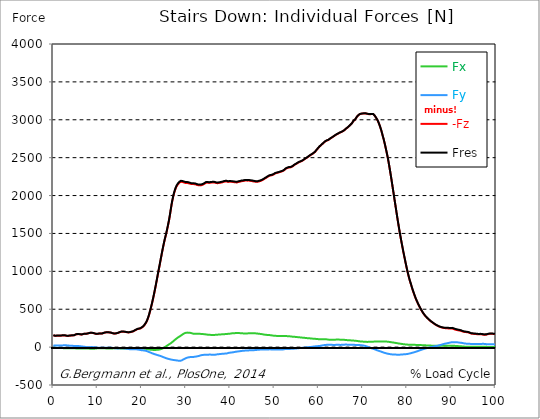
| Category |  Fx |  Fy |  -Fz |  Fres |
|---|---|---|---|---|
| 0.0 | -9.16 | 22.89 | 155.82 | 157.87 |
| 0.167348456675344 | -9.49 | 23.09 | 152.48 | 154.61 |
| 0.334696913350688 | -9.52 | 22.23 | 149.1 | 151.15 |
| 0.5020453700260321 | -9.45 | 20.8 | 147.47 | 149.35 |
| 0.669393826701376 | -9.99 | 20.54 | 149.6 | 151.47 |
| 0.83674228337672 | -10.46 | 20.52 | 150.97 | 152.86 |
| 1.0040907400520642 | -10.82 | 20.86 | 151.29 | 153.24 |
| 1.1621420602454444 | -11.21 | 21.27 | 151.46 | 153.48 |
| 1.3294905169207885 | -11.56 | 21.58 | 151.35 | 153.42 |
| 1.4968389735961325 | -11.87 | 21.76 | 151.11 | 153.22 |
| 1.6641874302714765 | -12.12 | 21.72 | 151.21 | 153.3 |
| 1.8315358869468206 | -12.44 | 21.9 | 151.99 | 154.1 |
| 1.9988843436221646 | -12.81 | 22.2 | 152.99 | 155.16 |
| 2.1662328002975086 | -13.33 | 22.83 | 153.65 | 155.95 |
| 2.333581256972853 | -13.98 | 23.44 | 153.94 | 156.39 |
| 2.5009297136481967 | -14.52 | 23.84 | 153.37 | 155.95 |
| 2.6682781703235405 | -14.69 | 23.63 | 152.65 | 155.23 |
| 2.8356266269988843 | -14.75 | 23.31 | 150.67 | 153.25 |
| 3.002975083674229 | -14.78 | 22.97 | 148.43 | 151.01 |
| 3.1703235403495724 | -14.68 | 21.73 | 147.75 | 150.15 |
| 3.337671997024917 | -14.65 | 20.61 | 147.42 | 149.69 |
| 3.4957233172182973 | -14.83 | 19.71 | 149.29 | 151.45 |
| 3.663071773893641 | -15.05 | 19.29 | 150.91 | 153.03 |
| 3.8304202305689854 | -15.22 | 18.86 | 151.89 | 153.96 |
| 3.997768687244329 | -15.37 | 18.33 | 152.61 | 154.6 |
| 4.165117143919673 | -15.52 | 17.8 | 153.38 | 155.29 |
| 4.332465600595017 | -15.64 | 17.13 | 154.09 | 155.9 |
| 4.499814057270361 | -15.7 | 16.07 | 154.5 | 156.17 |
| 4.667162513945706 | -15.73 | 14.96 | 155.56 | 157.1 |
| 4.834510970621049 | -15.98 | 14.21 | 160.69 | 162.16 |
| 5.001859427296393 | -16.6 | 14.27 | 165.57 | 167.05 |
| 5.169207883971737 | -17.25 | 14.56 | 168.1 | 169.66 |
| 5.336556340647081 | -17.75 | 14.38 | 170.51 | 172.08 |
| 5.503904797322425 | -18.27 | 14.1 | 171.8 | 173.39 |
| 5.671253253997769 | -18.68 | 13.67 | 171.82 | 173.42 |
| 5.82930457419115 | -18.97 | 13.1 | 170.63 | 172.23 |
| 5.996653030866494 | -19.15 | 12.35 | 169.05 | 170.62 |
| 6.164001487541838 | -19.1 | 11.01 | 167.71 | 169.21 |
| 6.331349944217181 | -18.91 | 9.41 | 166.06 | 167.45 |
| 6.498698400892526 | -18.86 | 8.03 | 167.76 | 169.07 |
| 6.66604685756787 | -18.85 | 6.7 | 170.18 | 171.43 |
| 6.833395314243213 | -19.04 | 5.73 | 173.11 | 174.32 |
| 7.000743770918558 | -19.59 | 5.39 | 176.33 | 177.56 |
| 7.168092227593902 | -19.43 | 3.8 | 175.71 | 176.88 |
| 7.335440684269246 | -18.95 | 1.55 | 175.1 | 176.18 |
| 7.50278914094459 | -18.54 | -0.43 | 175.36 | 176.37 |
| 7.6701375976199335 | -18.47 | -1.38 | 178.2 | 179.19 |
| 7.837486054295278 | -18.98 | -1.07 | 181.59 | 182.62 |
| 7.995537374488658 | -19.49 | -0.81 | 183.07 | 184.14 |
| 8.162885831164003 | -20.09 | -0.51 | 185.28 | 186.4 |
| 8.330234287839346 | -20.71 | -0.25 | 188.39 | 189.56 |
| 8.49758274451469 | -21.21 | -0.15 | 188.85 | 190.06 |
| 8.664931201190035 | -21.69 | 0.11 | 188.81 | 190.07 |
| 8.832279657865378 | -21.8 | -0.03 | 187.63 | 188.92 |
| 8.999628114540721 | -21.65 | -0.34 | 185.71 | 187 |
| 9.166976571216066 | -21.29 | -0.78 | 183.13 | 184.4 |
| 9.334325027891412 | -20.39 | -1.76 | 179.9 | 181.11 |
| 9.501673484566755 | -19.14 | -3.19 | 176.65 | 177.77 |
| 9.669021941242098 | -17.88 | -4.83 | 174.48 | 175.54 |
| 9.836370397917442 | -16.6 | -6.27 | 173.79 | 174.78 |
| 10.003718854592787 | -15.54 | -7.38 | 174.67 | 175.6 |
| 10.17106731126813 | -14.78 | -8.24 | 175.96 | 176.85 |
| 10.329118631461512 | -14.58 | -8.43 | 178.68 | 179.54 |
| 10.496467088136853 | -15.08 | -7.61 | 179.69 | 180.56 |
| 10.663815544812199 | -15.01 | -7.97 | 178.7 | 179.59 |
| 10.831164001487544 | -14.57 | -9.21 | 177.78 | 178.7 |
| 10.998512458162887 | -14.37 | -9.94 | 179.1 | 180.05 |
| 11.16586091483823 | -14.45 | -10.17 | 182.15 | 183.1 |
| 11.333209371513574 | -14.9 | -9.86 | 185.92 | 186.86 |
| 11.50055782818892 | -15.4 | -9.53 | 189.41 | 190.35 |
| 11.667906284864264 | -16.22 | -8.82 | 192.56 | 193.52 |
| 11.835254741539607 | -17.03 | -8.16 | 194.57 | 195.55 |
| 12.00260319821495 | -17.73 | -7.68 | 195.25 | 196.27 |
| 12.169951654890292 | -18.38 | -7.29 | 195.77 | 196.83 |
| 12.337300111565641 | -18.79 | -7.17 | 195.31 | 196.4 |
| 12.504648568240984 | -19.02 | -7.23 | 194.37 | 195.5 |
| 12.662699888434362 | -19.22 | -7.24 | 193.53 | 194.68 |
| 12.830048345109708 | -19.39 | -7.26 | 192.66 | 193.82 |
| 12.997396801785053 | -19.04 | -7.84 | 190.66 | 191.82 |
| 13.164745258460396 | -18.52 | -8.72 | 187.47 | 188.65 |
| 13.33209371513574 | -17.8 | -10.02 | 183.85 | 185.06 |
| 13.499442171811083 | -16.85 | -11.58 | 181.25 | 182.5 |
| 13.666790628486426 | -15.84 | -12.95 | 179.54 | 180.82 |
| 13.834139085161771 | -15.03 | -14.16 | 178.75 | 180.06 |
| 14.001487541837117 | -14.6 | -15.21 | 179.49 | 180.83 |
| 14.16883599851246 | -14.34 | -16.13 | 180.72 | 182.1 |
| 14.336184455187803 | -14.41 | -16.69 | 182.67 | 184.08 |
| 14.503532911863147 | -14.73 | -17.03 | 185.28 | 186.72 |
| 14.670881368538492 | -15.28 | -17.06 | 188.56 | 190.01 |
| 14.828932688731873 | -15.98 | -16.81 | 192.54 | 193.99 |
| 14.996281145407215 | -16.99 | -16.45 | 196.43 | 197.9 |
| 15.163629602082558 | -18.12 | -16.14 | 200.28 | 201.78 |
| 15.330978058757903 | -18.94 | -15.98 | 202.92 | 204.46 |
| 15.498326515433247 | -19.64 | -16.03 | 203.81 | 205.41 |
| 15.665674972108594 | -19.85 | -16.21 | 203.57 | 205.22 |
| 15.833023428783937 | -19.84 | -16.56 | 203.56 | 205.23 |
| 16.00037188545928 | -19.73 | -17.07 | 202.83 | 204.53 |
| 16.167720342134626 | -19.31 | -17.97 | 201.37 | 203.13 |
| 16.335068798809967 | -18.68 | -19.11 | 199.68 | 201.52 |
| 16.502417255485312 | -17.76 | -20.55 | 197.77 | 199.69 |
| 16.669765712160658 | -16.66 | -22.15 | 195.93 | 197.96 |
| 16.837114168836 | -15.44 | -23.75 | 194.41 | 196.56 |
| 17.004462625511344 | -14.16 | -25.31 | 193.71 | 195.99 |
| 17.16251394570472 | -13.1 | -26.7 | 194.54 | 196.92 |
| 17.32986240238007 | -12.29 | -27.82 | 196.38 | 198.84 |
| 17.497210859055414 | -11.89 | -28.48 | 198.99 | 201.5 |
| 17.664559315730756 | -11.54 | -29.09 | 201.31 | 203.84 |
| 17.8319077724061 | -12.12 | -28.77 | 203.42 | 205.94 |
| 17.999256229081443 | -12.63 | -28.57 | 206.62 | 209.1 |
| 18.166604685756788 | -13.29 | -28.3 | 211.44 | 213.88 |
| 18.333953142432133 | -14.27 | -28.11 | 217.42 | 219.82 |
| 18.501301599107478 | -15.4 | -28.16 | 222.91 | 225.33 |
| 18.668650055782823 | -16.52 | -28.58 | 227.45 | 229.95 |
| 18.835998512458165 | -17.5 | -29.37 | 232.34 | 234.95 |
| 19.00334696913351 | -18.41 | -30.59 | 237.66 | 240.42 |
| 19.170695425808855 | -18.69 | -31.83 | 240.12 | 243.02 |
| 19.338043882484197 | -18.34 | -33.73 | 241.93 | 245.02 |
| 19.496095202677576 | -17.73 | -35.94 | 244.01 | 247.34 |
| 19.66344365935292 | -16.97 | -38.07 | 246.4 | 249.97 |
| 19.830792116028263 | -16.53 | -39.95 | 250.06 | 253.86 |
| 19.998140572703612 | -17.3 | -41.3 | 257.66 | 261.6 |
| 20.165489029378953 | -17.8 | -42.34 | 264.84 | 268.87 |
| 20.3328374860543 | -18.72 | -42.86 | 272.29 | 276.35 |
| 20.500185942729644 | -19.86 | -44.02 | 282.55 | 286.72 |
| 20.667534399404985 | -21.26 | -45.98 | 296.39 | 300.75 |
| 20.83488285608033 | -22.73 | -47.48 | 308.97 | 313.48 |
| 21.002231312755672 | -24.32 | -50.17 | 326.22 | 331.01 |
| 21.16957976943102 | -25.97 | -53.54 | 346.76 | 351.9 |
| 21.336928226106362 | -27.73 | -57.22 | 370.89 | 376.37 |
| 21.504276682781704 | -29.51 | -61.04 | 397.71 | 403.51 |
| 21.67162513945705 | -31.08 | -65.09 | 430.25 | 436.32 |
| 21.82967645965043 | -32.6 | -69.21 | 466.25 | 472.55 |
| 21.997024916325774 | -33.96 | -73.28 | 503.44 | 509.94 |
| 22.16437337300112 | -35.09 | -77.51 | 542.06 | 548.76 |
| 22.33172182967646 | -35.96 | -81.75 | 582.2 | 589.09 |
| 22.499070286351806 | -36.68 | -85.5 | 625.29 | 632.26 |
| 22.666418743027148 | -37.28 | -88.86 | 670.4 | 677.38 |
| 22.833767199702496 | -37.69 | -92.04 | 717.51 | 724.46 |
| 23.00111565637784 | -37.5 | -95.14 | 765.56 | 772.45 |
| 23.168464113053183 | -36.64 | -98.15 | 815.32 | 822.13 |
| 23.335812569728528 | -36.15 | -101.13 | 865.42 | 872.16 |
| 23.50316102640387 | -35.46 | -104.37 | 918.98 | 925.68 |
| 23.670509483079215 | -34.35 | -107.33 | 970.09 | 976.72 |
| 23.83785793975456 | -32.92 | -110.11 | 1020.82 | 1027.38 |
| 23.995909259947936 | -31.12 | -112.9 | 1071.5 | 1077.96 |
| 24.163257716623285 | -28.6 | -116.14 | 1122.92 | 1129.37 |
| 24.330606173298627 | -25.85 | -119.58 | 1174.81 | 1181.26 |
| 24.49795462997397 | -22.29 | -123.34 | 1225.18 | 1231.67 |
| 24.665303086649313 | -17.99 | -127.37 | 1275.25 | 1281.82 |
| 24.83265154332466 | -13.43 | -131.45 | 1324.68 | 1331.34 |
| 25.0 | -8.04 | -135.09 | 1369.23 | 1376 |
| 25.167348456675345 | -2.21 | -138.92 | 1413.29 | 1420.22 |
| 25.334696913350694 | 4.08 | -142.64 | 1451.63 | 1458.73 |
| 25.502045370026035 | 10.59 | -146.27 | 1491.35 | 1498.62 |
| 25.669393826701377 | 17.35 | -149.62 | 1534.36 | 1541.8 |
| 25.836742283376722 | 24.07 | -152.76 | 1580.52 | 1588.14 |
| 26.004090740052067 | 30.53 | -155.41 | 1627.95 | 1635.71 |
| 26.17143919672741 | 36.85 | -157.76 | 1675.42 | 1683.3 |
| 26.329490516920792 | 42.66 | -160.51 | 1733.06 | 1741.08 |
| 26.49683897359613 | 48.99 | -163.1 | 1794.27 | 1802.39 |
| 26.66418743027148 | 55.86 | -164.6 | 1855.33 | 1863.53 |
| 26.831535886946828 | 63.55 | -166.26 | 1911.75 | 1920.11 |
| 26.998884343622166 | 72.15 | -168.48 | 1958 | 1966.64 |
| 27.166232800297514 | 80.38 | -170.04 | 2003.2 | 2012.1 |
| 27.333581256972852 | 88.71 | -171.26 | 2037.13 | 2046.34 |
| 27.5009297136482 | 96.88 | -172.46 | 2069.04 | 2078.57 |
| 27.668278170323543 | 104.81 | -173.74 | 2096.3 | 2106.18 |
| 27.835626626998888 | 112.41 | -175.24 | 2117.28 | 2127.59 |
| 28.002975083674233 | 120.04 | -176.6 | 2135 | 2145.75 |
| 28.170323540349575 | 127.57 | -178.09 | 2148.45 | 2159.68 |
| 28.33767199702492 | 133.62 | -179.65 | 2159.14 | 2170.81 |
| 28.50502045370026 | 139.14 | -180.92 | 2170.66 | 2182.7 |
| 28.663071773893645 | 145.27 | -181.13 | 2178.99 | 2191.4 |
| 28.830420230568986 | 152.11 | -179.22 | 2181.98 | 2194.68 |
| 28.99776868724433 | 158.87 | -175.4 | 2182.6 | 2195.49 |
| 29.165117143919673 | 166.14 | -170.24 | 2179.12 | 2192.16 |
| 29.33246560059502 | 172.55 | -165.09 | 2176.04 | 2189.21 |
| 29.499814057270367 | 178.44 | -159.57 | 2173.25 | 2186.5 |
| 29.66716251394571 | 183.14 | -154.16 | 2170.6 | 2183.87 |
| 29.834510970621054 | 186.97 | -149.42 | 2166.68 | 2179.98 |
| 30.00185942729639 | 189.24 | -145.08 | 2166.55 | 2179.76 |
| 30.169207883971744 | 190.72 | -140.87 | 2166.32 | 2179.4 |
| 30.33655634064708 | 191.3 | -137.96 | 2166.18 | 2179.12 |
| 30.50390479732243 | 191.19 | -135.67 | 2162.99 | 2175.8 |
| 30.671253253997772 | 190.31 | -133.55 | 2161.47 | 2174.08 |
| 30.829304574191156 | 189.24 | -131.77 | 2157.81 | 2170.24 |
| 30.996653030866494 | 187.57 | -131.2 | 2153.82 | 2166.08 |
| 31.164001487541842 | 185.19 | -131.2 | 2151.67 | 2163.73 |
| 31.331349944217187 | 182.09 | -130.82 | 2151.24 | 2163.01 |
| 31.498698400892525 | 178.82 | -130.7 | 2151.9 | 2163.39 |
| 31.666046857567874 | 176.58 | -129.97 | 2152.21 | 2163.47 |
| 31.833395314243212 | 175.59 | -128.63 | 2150.4 | 2161.52 |
| 32.00074377091856 | 175.09 | -126.92 | 2150.48 | 2161.47 |
| 32.1680922275939 | 174.77 | -125.3 | 2147.36 | 2158.26 |
| 32.33544068426925 | 175.67 | -123.61 | 2143.1 | 2153.98 |
| 32.50278914094459 | 176.1 | -121.72 | 2139.32 | 2150.15 |
| 32.670137597619934 | 176.18 | -119.6 | 2136.43 | 2147.17 |
| 32.83748605429528 | 175.86 | -117.11 | 2135.32 | 2145.92 |
| 33.004834510970625 | 175.54 | -114.63 | 2134.21 | 2144.67 |
| 33.162885831164004 | 174.97 | -111.75 | 2134.27 | 2144.57 |
| 33.33023428783935 | 174.38 | -108.75 | 2135.62 | 2145.73 |
| 33.497582744514695 | 173.75 | -106.04 | 2137.51 | 2147.48 |
| 33.664931201190036 | 173.1 | -103.58 | 2139.86 | 2149.69 |
| 33.83227965786538 | 172.23 | -102.62 | 2144.46 | 2154.18 |
| 33.99962811454073 | 170.93 | -102.32 | 2149.24 | 2158.84 |
| 34.16697657121607 | 169.84 | -102.01 | 2155.83 | 2165.31 |
| 34.33432502789141 | 168.76 | -101.7 | 2162.43 | 2171.79 |
| 34.50167348456676 | 167.59 | -101.59 | 2168.62 | 2177.86 |
| 34.6690219412421 | 165.82 | -101.05 | 2171.95 | 2181.02 |
| 34.83637039791744 | 164.29 | -100.84 | 2170.78 | 2179.73 |
| 35.00371885459279 | 163.63 | -99.72 | 2167.65 | 2176.52 |
| 35.17106731126814 | 162.97 | -99.04 | 2166.9 | 2175.68 |
| 35.338415767943474 | 162.37 | -98.65 | 2167.18 | 2175.9 |
| 35.49646708813686 | 161.64 | -98.9 | 2169.43 | 2178.09 |
| 35.6638155448122 | 160.93 | -99.33 | 2170.85 | 2179.47 |
| 35.831164001487544 | 160.29 | -99.7 | 2171.71 | 2180.3 |
| 35.998512458162885 | 159.97 | -99.91 | 2173.09 | 2181.66 |
| 36.165860914838234 | 160.25 | -100.1 | 2174 | 2182.59 |
| 36.333209371513576 | 160.64 | -100.15 | 2173.64 | 2182.26 |
| 36.50055782818892 | 161.27 | -100 | 2170.99 | 2179.66 |
| 36.667906284864266 | 161.98 | -99.4 | 2167.13 | 2175.84 |
| 36.83525474153961 | 162.68 | -97.59 | 2164.42 | 2173.09 |
| 37.002603198214956 | 163.49 | -95.88 | 2163.24 | 2171.86 |
| 37.1699516548903 | 164.48 | -94.83 | 2163.51 | 2172.13 |
| 37.337300111565646 | 165.34 | -93.52 | 2165.71 | 2174.3 |
| 37.50464856824098 | 166.07 | -92.6 | 2166.7 | 2175.28 |
| 37.66269988843437 | 166.77 | -91.58 | 2168.27 | 2176.83 |
| 37.83004834510971 | 167.47 | -90.51 | 2170.09 | 2178.63 |
| 37.99739680178505 | 168.19 | -89.43 | 2172.14 | 2180.66 |
| 38.16474525846039 | 168.92 | -88.34 | 2174.35 | 2182.85 |
| 38.33209371513574 | 169.53 | -87.33 | 2177.2 | 2185.68 |
| 38.49944217181109 | 169.99 | -86.51 | 2180.95 | 2189.41 |
| 38.666790628486424 | 170.81 | -86.11 | 2183.43 | 2191.93 |
| 38.83413908516178 | 171.79 | -85.79 | 2185.39 | 2193.95 |
| 39.001487541837115 | 172.59 | -85.13 | 2187.43 | 2196.02 |
| 39.16883599851246 | 173.56 | -83.82 | 2185.89 | 2194.52 |
| 39.336184455187805 | 174.33 | -82.15 | 2181.88 | 2190.51 |
| 39.503532911863154 | 175.26 | -79.02 | 2180.17 | 2188.79 |
| 39.670881368538495 | 175.78 | -75.7 | 2182.5 | 2191.06 |
| 39.83822982521384 | 176.56 | -73.76 | 2182.92 | 2191.5 |
| 39.996281145407224 | 177.91 | -72.91 | 2182.36 | 2191.04 |
| 40.163629602082565 | 179.69 | -72.23 | 2181.82 | 2190.64 |
| 40.33097805875791 | 181.66 | -71.37 | 2181.39 | 2190.36 |
| 40.498326515433256 | 182.75 | -69.17 | 2180.48 | 2189.49 |
| 40.6656749721086 | 183.55 | -67.51 | 2179.51 | 2188.55 |
| 40.83302342878393 | 184.25 | -66.01 | 2176.99 | 2186.05 |
| 41.00037188545929 | 184.39 | -64.22 | 2175.37 | 2184.39 |
| 41.16772034213463 | 184.66 | -62.35 | 2174.44 | 2183.44 |
| 41.33506879880997 | 184.95 | -60.46 | 2173.6 | 2182.58 |
| 41.50241725548531 | 185.09 | -58.8 | 2173.2 | 2182.16 |
| 41.66976571216066 | 185.12 | -57.51 | 2175 | 2183.92 |
| 41.837114168836 | 185.32 | -56.98 | 2179.56 | 2188.45 |
| 42.004462625511344 | 185.05 | -55.49 | 2181.81 | 2190.62 |
| 42.17181108218669 | 184.23 | -53.88 | 2182.62 | 2191.31 |
| 42.32986240238007 | 183.72 | -52.68 | 2186.2 | 2194.78 |
| 42.497210859055414 | 183.12 | -51.41 | 2189.31 | 2197.78 |
| 42.66455931573076 | 182.04 | -49.77 | 2190.08 | 2198.42 |
| 42.831907772406105 | 181.23 | -48.37 | 2191.43 | 2199.67 |
| 42.999256229081446 | 180.87 | -47.41 | 2193.55 | 2201.73 |
| 43.16660468575679 | 180.55 | -46.74 | 2195.43 | 2203.56 |
| 43.33395314243214 | 180.22 | -46.12 | 2197.42 | 2205.51 |
| 43.50130159910748 | 180.37 | -45.83 | 2198.56 | 2206.66 |
| 43.66865005578282 | 180.72 | -44.99 | 2197.73 | 2205.85 |
| 43.83599851245817 | 180.97 | -44.63 | 2196.73 | 2204.87 |
| 44.00334696913351 | 181.33 | -44.2 | 2197.14 | 2205.31 |
| 44.17069542580886 | 181.52 | -43.25 | 2197.79 | 2205.96 |
| 44.3380438824842 | 182.03 | -42.34 | 2197.29 | 2205.49 |
| 44.49609520267758 | 183.16 | -42.1 | 2194.39 | 2202.7 |
| 44.66344365935292 | 183.75 | -41.64 | 2191.2 | 2199.56 |
| 44.83079211602827 | 183.76 | -40.69 | 2191.62 | 2199.99 |
| 44.99814057270361 | 184.05 | -40.77 | 2190.52 | 2198.94 |
| 45.16548902937895 | 184.15 | -40.82 | 2187.85 | 2196.3 |
| 45.332837486054295 | 183.73 | -40.75 | 2185.87 | 2194.3 |
| 45.500185942729644 | 182.78 | -39.71 | 2184.22 | 2192.55 |
| 45.66753439940499 | 181.81 | -38.79 | 2182.46 | 2190.7 |
| 45.83488285608033 | 180.83 | -37.99 | 2180.66 | 2188.81 |
| 46.00223131275568 | 179.66 | -36.77 | 2180.49 | 2188.53 |
| 46.16957976943102 | 178.48 | -35.41 | 2181.39 | 2189.31 |
| 46.336928226106366 | 177.35 | -33.99 | 2184.36 | 2192.18 |
| 46.50427668278171 | 176.22 | -33.39 | 2187.2 | 2194.93 |
| 46.671625139457056 | 175.12 | -33.13 | 2189.91 | 2197.57 |
| 46.829676459650436 | 173.79 | -32.86 | 2192.51 | 2200.06 |
| 46.99702491632577 | 172.4 | -32.61 | 2196.5 | 2203.93 |
| 47.16437337300112 | 170.87 | -32.31 | 2201.54 | 2208.84 |
| 47.33172182967646 | 169.2 | -31.98 | 2206.64 | 2213.8 |
| 47.49907028635181 | 167.31 | -31.98 | 2212.13 | 2219.15 |
| 47.66641874302716 | 165.34 | -31.75 | 2219.05 | 2225.92 |
| 47.83376719970249 | 163.76 | -31.36 | 2225.06 | 2231.81 |
| 48.001115656377834 | 162.64 | -30.98 | 2230.9 | 2237.54 |
| 48.16846411305319 | 161.73 | -30.81 | 2236.77 | 2243.32 |
| 48.33581256972853 | 160.79 | -30.6 | 2242.98 | 2249.43 |
| 48.50316102640387 | 160.1 | -30.44 | 2249.6 | 2255.96 |
| 48.67050948307921 | 159.53 | -30.18 | 2255.49 | 2261.77 |
| 48.837857939754564 | 159.02 | -29.81 | 2260.85 | 2267.05 |
| 49.005206396429905 | 157.95 | -29.6 | 2264.9 | 2271 |
| 49.163257716623285 | 156.67 | -29.94 | 2265.65 | 2271.67 |
| 49.33060617329863 | 155 | -30.52 | 2267.64 | 2273.56 |
| 49.49795462997397 | 153.39 | -31.1 | 2270.4 | 2276.22 |
| 49.66530308664932 | 151.87 | -31.68 | 2274.21 | 2279.94 |
| 49.832651543324666 | 150.83 | -31.83 | 2279.67 | 2285.33 |
| 50.0 | 150 | -31.7 | 2286.23 | 2291.82 |
| 50.16734845667534 | 149.19 | -31.56 | 2292.7 | 2298.22 |
| 50.33469691335069 | 148.51 | -31.9 | 2295.46 | 2300.95 |
| 50.50204537002604 | 147.83 | -32.25 | 2298.23 | 2303.69 |
| 50.66939382670139 | 147.34 | -32.38 | 2300.67 | 2306.1 |
| 50.836742283376715 | 146.93 | -32.31 | 2303.25 | 2308.66 |
| 51.00409074005207 | 146.47 | -32.22 | 2306.21 | 2311.57 |
| 51.17143919672741 | 146.32 | -32.1 | 2309.16 | 2314.51 |
| 51.32949051692079 | 146.42 | -32.14 | 2312.43 | 2317.78 |
| 51.496838973596134 | 146.65 | -32.29 | 2315.81 | 2321.16 |
| 51.66418743027148 | 147.17 | -32.45 | 2318.13 | 2323.52 |
| 51.831535886946824 | 147.43 | -31.93 | 2322.08 | 2327.46 |
| 51.99888434362217 | 147.12 | -30.01 | 2328.1 | 2333.44 |
| 52.16623280029752 | 146.48 | -28.33 | 2333.94 | 2339.22 |
| 52.33358125697285 | 145.8 | -26.32 | 2343.88 | 2349.1 |
| 52.5009297136482 | 145.27 | -24.88 | 2352.39 | 2357.58 |
| 52.668278170323546 | 145.21 | -24.79 | 2356.95 | 2362.13 |
| 52.835626626998895 | 145.2 | -24.79 | 2361.58 | 2366.76 |
| 53.00297508367424 | 144.68 | -24.76 | 2366.27 | 2371.42 |
| 53.17032354034958 | 144.08 | -24.76 | 2370.06 | 2375.17 |
| 53.33767199702492 | 143.16 | -24.73 | 2369.71 | 2374.77 |
| 53.50502045370027 | 142.16 | -24.1 | 2370.51 | 2375.5 |
| 53.663071773893655 | 140.91 | -23.11 | 2373.39 | 2378.29 |
| 53.83042023056899 | 139.4 | -22.52 | 2377.08 | 2381.89 |
| 53.99776868724433 | 138.31 | -21.66 | 2382.66 | 2387.41 |
| 54.16511714391967 | 137.27 | -20.67 | 2388.08 | 2392.77 |
| 54.33246560059503 | 136.63 | -20.69 | 2398.21 | 2402.88 |
| 54.49981405727037 | 136 | -20.34 | 2404.79 | 2409.41 |
| 54.667162513945705 | 135.1 | -19.55 | 2409.47 | 2414.01 |
| 54.834510970621054 | 133.55 | -18.13 | 2415.22 | 2419.63 |
| 55.0018594272964 | 132.13 | -17.22 | 2422.64 | 2426.96 |
| 55.169207883971744 | 131.85 | -16.08 | 2427.59 | 2431.88 |
| 55.336556340647086 | 131.42 | -15.12 | 2433.41 | 2437.66 |
| 55.50390479732243 | 130.33 | -13.88 | 2438.92 | 2443.08 |
| 55.671253253997776 | 129.27 | -12.83 | 2443.38 | 2447.45 |
| 55.83860171067312 | 128.06 | -12.07 | 2447.38 | 2451.36 |
| 55.9966530308665 | 126.44 | -11 | 2451.43 | 2455.36 |
| 56.16400148754184 | 125.38 | -9.66 | 2455.45 | 2459.33 |
| 56.33134994421718 | 124.96 | -8.38 | 2460.27 | 2464.12 |
| 56.498698400892536 | 124.28 | -7.67 | 2466.83 | 2470.63 |
| 56.66604685756788 | 123.5 | -7.19 | 2474.12 | 2477.86 |
| 56.83339531424321 | 122.37 | -6.4 | 2482.08 | 2485.76 |
| 57.00074377091856 | 120.86 | -5.31 | 2487.81 | 2491.43 |
| 57.16809222759391 | 119.51 | -4.15 | 2493.25 | 2496.81 |
| 57.33544068426925 | 118.57 | -2.85 | 2499.7 | 2503.23 |
| 57.5027891409446 | 117.85 | -1.47 | 2507.12 | 2510.63 |
| 57.670137597619934 | 117.13 | -0.39 | 2514.61 | 2518.09 |
| 57.83748605429528 | 116.65 | 0.34 | 2521.15 | 2524.62 |
| 58.004834510970625 | 115.83 | 0.9 | 2528.37 | 2531.79 |
| 58.16288583116401 | 114.37 | 1.82 | 2535.08 | 2538.43 |
| 58.330234287839346 | 112.98 | 2.81 | 2541.22 | 2544.52 |
| 58.497582744514695 | 112.04 | 4.09 | 2546.44 | 2549.7 |
| 58.66493120119004 | 111.73 | 5.66 | 2552.14 | 2555.39 |
| 58.832279657865385 | 111.29 | 7.42 | 2560.12 | 2563.37 |
| 58.999628114540734 | 110.52 | 8.3 | 2567.42 | 2570.65 |
| 59.16697657121607 | 109.48 | 9.14 | 2576.06 | 2579.24 |
| 59.33432502789142 | 108.45 | 10.31 | 2588.35 | 2591.49 |
| 59.50167348456676 | 107.4 | 11.36 | 2600.47 | 2603.56 |
| 59.66902194124211 | 106.41 | 12.18 | 2611.87 | 2614.92 |
| 59.83637039791745 | 105.51 | 13.12 | 2623.51 | 2626.54 |
| 60.00371885459278 | 104.6 | 14.05 | 2635.16 | 2638.17 |
| 60.17106731126813 | 104.24 | 15.34 | 2646.05 | 2649.05 |
| 60.33841576794349 | 103.81 | 16.66 | 2653.99 | 2656.97 |
| 60.49646708813685 | 104.09 | 18.41 | 2663.33 | 2666.31 |
| 60.6638155448122 | 104.47 | 20.39 | 2672.19 | 2675.19 |
| 60.831164001487544 | 104.8 | 22.39 | 2681.01 | 2684.03 |
| 60.99851245816289 | 105.03 | 24.29 | 2689.98 | 2693.02 |
| 61.16586091483824 | 105.04 | 25.95 | 2699.27 | 2702.32 |
| 61.333209371513576 | 104.83 | 27.31 | 2708.33 | 2711.37 |
| 61.50055782818892 | 104.25 | 28.26 | 2715.88 | 2718.88 |
| 61.667906284864266 | 103.64 | 29.15 | 2722.47 | 2725.43 |
| 61.835254741539615 | 102.3 | 29.9 | 2726.51 | 2729.38 |
| 62.002603198214956 | 100.21 | 31.16 | 2728.85 | 2731.57 |
| 62.16995165489029 | 98.48 | 32.11 | 2732.57 | 2735.15 |
| 62.33730011156564 | 97.79 | 32.13 | 2739.59 | 2742.13 |
| 62.504648568240995 | 97.21 | 31.8 | 2747.98 | 2750.47 |
| 62.67199702491633 | 97.38 | 31.67 | 2754.11 | 2756.6 |
| 62.83004834510971 | 97.86 | 31.09 | 2760.31 | 2762.8 |
| 62.99739680178505 | 98.13 | 29.86 | 2767.36 | 2769.83 |
| 63.1647452584604 | 98.52 | 29 | 2773.46 | 2775.93 |
| 63.33209371513575 | 98.23 | 28.65 | 2780.56 | 2782.99 |
| 63.4994421718111 | 98.03 | 28.86 | 2786.1 | 2788.49 |
| 63.666790628486424 | 97.96 | 28.98 | 2793.82 | 2796.19 |
| 63.83413908516177 | 98.53 | 29.66 | 2800.1 | 2802.48 |
| 64.00148754183712 | 99.49 | 30.21 | 2806.27 | 2808.69 |
| 64.16883599851248 | 100.01 | 30.66 | 2810.74 | 2813.16 |
| 64.3361844551878 | 100.07 | 30.67 | 2815.28 | 2817.7 |
| 64.50353291186315 | 99.22 | 29.57 | 2821.25 | 2823.63 |
| 64.6708813685385 | 98.91 | 29.51 | 2826.5 | 2828.87 |
| 64.83822982521384 | 98.62 | 29.55 | 2831.7 | 2834.06 |
| 65.00557828188919 | 97.96 | 29.31 | 2836.97 | 2839.3 |
| 65.16362960208257 | 97.85 | 30.45 | 2839.75 | 2842.05 |
| 65.3309780587579 | 97.71 | 31.57 | 2844.07 | 2846.35 |
| 65.49832651543326 | 97.03 | 31.58 | 2850.38 | 2852.62 |
| 65.6656749721086 | 96.62 | 31.96 | 2857.46 | 2859.68 |
| 65.83302342878395 | 95.75 | 32.41 | 2864.24 | 2866.41 |
| 66.00037188545929 | 94.5 | 33.19 | 2873.84 | 2875.94 |
| 66.16772034213463 | 93.38 | 33.41 | 2882.23 | 2884.26 |
| 66.33506879880998 | 92.42 | 32.93 | 2889.08 | 2891.07 |
| 66.50241725548531 | 91.47 | 32.46 | 2896.62 | 2898.55 |
| 66.66976571216065 | 90.73 | 32.28 | 2905.45 | 2907.35 |
| 66.83711416883601 | 90.32 | 32.48 | 2913.97 | 2915.84 |
| 67.00446262551135 | 89.83 | 32.74 | 2922.73 | 2924.57 |
| 67.1718110821867 | 89.26 | 32.88 | 2932.78 | 2934.6 |
| 67.32986240238007 | 88.54 | 31.95 | 2940.23 | 2942.02 |
| 67.49721085905541 | 87.84 | 31.65 | 2952.37 | 2954.13 |
| 67.66455931573076 | 87.17 | 31.67 | 2966.74 | 2968.47 |
| 67.83190777240611 | 86.26 | 31.99 | 2984.79 | 2986.48 |
| 67.99925622908145 | 85.46 | 30.74 | 2995.17 | 2996.83 |
| 68.16660468575678 | 84.76 | 27.9 | 2997.71 | 2999.36 |
| 68.33395314243214 | 83.66 | 27.08 | 3010.54 | 3012.15 |
| 68.50130159910749 | 82.41 | 27.04 | 3027.22 | 3028.79 |
| 68.66865005578282 | 81.27 | 27.04 | 3041.77 | 3043.32 |
| 68.83599851245816 | 79.72 | 27 | 3053.29 | 3054.82 |
| 69.00334696913352 | 77.91 | 26.96 | 3062.57 | 3064.07 |
| 69.17069542580886 | 76.39 | 27.27 | 3071 | 3072.48 |
| 69.3380438824842 | 75.54 | 26.61 | 3075.57 | 3077.04 |
| 69.50539233915956 | 74.81 | 25.54 | 3077.85 | 3079.3 |
| 69.66344365935292 | 73.85 | 24.65 | 3080.35 | 3081.79 |
| 69.83079211602826 | 72.89 | 23.75 | 3082.86 | 3084.28 |
| 69.99814057270362 | 72.53 | 21.97 | 3082.79 | 3084.21 |
| 70.16548902937896 | 71.79 | 20.26 | 3083.62 | 3085.02 |
| 70.33283748605429 | 71 | 18.38 | 3084.13 | 3085.52 |
| 70.50018594272964 | 70.21 | 16.18 | 3083.91 | 3085.27 |
| 70.667534399405 | 69.45 | 13.32 | 3083.16 | 3084.51 |
| 70.83488285608033 | 68.93 | 9.9 | 3081.33 | 3082.65 |
| 71.00223131275568 | 68.73 | 6.3 | 3078.54 | 3079.86 |
| 71.16957976943102 | 69.86 | 2.41 | 3076.72 | 3078.05 |
| 71.33692822610637 | 70.44 | -1.66 | 3074.09 | 3075.43 |
| 71.50427668278171 | 70.74 | -5.83 | 3073.07 | 3074.42 |
| 71.67162513945706 | 71.25 | -9.88 | 3073.82 | 3075.17 |
| 71.8389735961324 | 71.18 | -13.09 | 3075.73 | 3077.07 |
| 71.99702491632577 | 71.41 | -15.96 | 3075.91 | 3077.25 |
| 72.16437337300113 | 71.68 | -18.82 | 3075.86 | 3077.19 |
| 72.33172182967647 | 72.19 | -21.99 | 3074.15 | 3075.49 |
| 72.49907028635181 | 72.65 | -25.6 | 3065.2 | 3066.56 |
| 72.66641874302715 | 72.9 | -29.25 | 3053.37 | 3054.75 |
| 72.8337671997025 | 73.3 | -33.04 | 3038.55 | 3039.96 |
| 73.00111565637783 | 73.73 | -36.96 | 3023.23 | 3024.69 |
| 73.16846411305319 | 74.31 | -40.85 | 3007.16 | 3008.67 |
| 73.33581256972853 | 75.04 | -44.45 | 2990.57 | 2992.15 |
| 73.50316102640387 | 75.33 | -47.86 | 2966.52 | 2968.16 |
| 73.67050948307921 | 75.19 | -51.01 | 2942.07 | 2943.76 |
| 73.83785793975457 | 75.11 | -54.25 | 2915.45 | 2917.2 |
| 74.00520639642991 | 74.94 | -57.5 | 2885.56 | 2887.38 |
| 74.16325771662328 | 75.11 | -60.98 | 2854.32 | 2856.22 |
| 74.33060617329863 | 75.09 | -64.51 | 2818.19 | 2820.18 |
| 74.49795462997398 | 74.97 | -68.07 | 2781 | 2783.08 |
| 74.66530308664932 | 75.03 | -71.58 | 2746.24 | 2748.43 |
| 74.83265154332466 | 74.61 | -74.7 | 2706.18 | 2708.46 |
| 75.00000000000001 | 74.09 | -77.61 | 2664.67 | 2667.05 |
| 75.16734845667534 | 73.57 | -80.24 | 2620.9 | 2623.37 |
| 75.3346969133507 | 72.84 | -82.84 | 2576.33 | 2578.89 |
| 75.50204537002605 | 71.99 | -85.2 | 2529.57 | 2532.23 |
| 75.66939382670138 | 71.07 | -87.7 | 2481.52 | 2484.27 |
| 75.83674228337672 | 69.81 | -89.68 | 2427.25 | 2430.08 |
| 76.00409074005208 | 68.29 | -91.37 | 2369.48 | 2372.4 |
| 76.17143919672742 | 66.66 | -92.99 | 2311.01 | 2314.02 |
| 76.33878765340276 | 65.16 | -94.57 | 2251.47 | 2254.57 |
| 76.49683897359614 | 63.66 | -96.08 | 2189.71 | 2192.9 |
| 76.66418743027148 | 62.02 | -97.12 | 2126.45 | 2129.72 |
| 76.83153588694682 | 60.4 | -97.85 | 2062.13 | 2065.49 |
| 76.99888434362218 | 59.07 | -98.31 | 1998.77 | 2002.21 |
| 77.16623280029752 | 57.68 | -98.7 | 1934.62 | 1938.14 |
| 77.33358125697285 | 55.91 | -98.93 | 1872.11 | 1875.7 |
| 77.5009297136482 | 54.16 | -99.11 | 1808.59 | 1812.26 |
| 77.66827817032356 | 52.25 | -99.41 | 1744.92 | 1748.67 |
| 77.83562662699889 | 50.41 | -99.64 | 1683.32 | 1687.16 |
| 78.00297508367423 | 48.71 | -99.96 | 1622.84 | 1626.79 |
| 78.17032354034959 | 47.22 | -100.01 | 1563.33 | 1567.38 |
| 78.33767199702493 | 45.83 | -99.56 | 1506.93 | 1511.06 |
| 78.50502045370027 | 44.23 | -98.89 | 1451.35 | 1455.53 |
| 78.67236891037561 | 42.74 | -98.07 | 1398.24 | 1402.48 |
| 78.83042023056899 | 41.22 | -97.28 | 1346.49 | 1350.79 |
| 78.99776868724433 | 39.83 | -96.46 | 1295.48 | 1299.83 |
| 79.16511714391969 | 38.47 | -95.67 | 1245.78 | 1250.19 |
| 79.33246560059503 | 37.22 | -94.88 | 1198.09 | 1202.57 |
| 79.49981405727036 | 36.07 | -94.18 | 1150.51 | 1155.07 |
| 79.66716251394571 | 34.96 | -93.4 | 1103.53 | 1108.17 |
| 79.83451097062107 | 33.92 | -92.35 | 1057.94 | 1062.65 |
| 80.00185942729641 | 33.04 | -90.98 | 1013.94 | 1018.7 |
| 80.16920788397174 | 32.47 | -89.22 | 971.88 | 976.67 |
| 80.33655634064709 | 32.12 | -87.14 | 932.63 | 937.42 |
| 80.50390479732243 | 31.88 | -84.87 | 896.03 | 900.79 |
| 80.67125325399778 | 31.72 | -82.4 | 862.34 | 867.04 |
| 80.83860171067312 | 31.38 | -79.85 | 832.11 | 836.71 |
| 80.99665303086651 | 30.97 | -77.44 | 799.11 | 803.65 |
| 81.16400148754184 | 30.52 | -74.97 | 767.22 | 771.67 |
| 81.3313499442172 | 30.15 | -72.43 | 738.23 | 742.58 |
| 81.49869840089255 | 29.96 | -69.46 | 709.64 | 713.84 |
| 81.66604685756786 | 29.82 | -66.39 | 682.36 | 686.42 |
| 81.83339531424322 | 29.57 | -63.36 | 656.22 | 660.13 |
| 82.00074377091858 | 29.26 | -60.28 | 631.15 | 634.89 |
| 82.16809222759392 | 28.83 | -57.32 | 608.72 | 612.3 |
| 82.33544068426926 | 28.47 | -54.05 | 587.41 | 590.8 |
| 82.50278914094459 | 28.23 | -50.36 | 566.62 | 569.8 |
| 82.67013759761994 | 27.93 | -46.77 | 547.09 | 550.08 |
| 82.83748605429528 | 27.49 | -43.13 | 528.18 | 531.02 |
| 83.00483451097062 | 26.78 | -38.84 | 509.55 | 512.35 |
| 83.17218296764597 | 26.37 | -35.49 | 491.92 | 494.6 |
| 83.33023428783935 | 26.01 | -32.3 | 474.77 | 477.43 |
| 83.4975827445147 | 25.53 | -28.94 | 458.8 | 461.5 |
| 83.66493120119004 | 24.99 | -25.94 | 444.1 | 446.8 |
| 83.83227965786537 | 24.38 | -22.72 | 430.1 | 432.8 |
| 83.99962811454073 | 23.8 | -19.75 | 417.34 | 420.07 |
| 84.16697657121607 | 23.28 | -17.25 | 406.02 | 408.76 |
| 84.33432502789142 | 22.66 | -14.8 | 395.39 | 398.17 |
| 84.50167348456677 | 22.1 | -12.49 | 385.3 | 388.09 |
| 84.6690219412421 | 21.53 | -10.24 | 375.99 | 378.83 |
| 84.83637039791745 | 21.04 | -7.92 | 366.59 | 369.48 |
| 85.0037188545928 | 20.59 | -5.62 | 357.53 | 360.51 |
| 85.17106731126813 | 20.14 | -3.42 | 349.23 | 352.22 |
| 85.33841576794349 | 19.78 | -1.22 | 340.97 | 343.93 |
| 85.50576422461883 | 19.39 | 0.84 | 333.52 | 336.46 |
| 85.66381554481221 | 19.02 | 2.74 | 327.02 | 329.95 |
| 85.83116400148755 | 18.85 | 4.93 | 319.58 | 322.48 |
| 85.99851245816289 | 18.68 | 7.23 | 312.39 | 315.27 |
| 86.16586091483823 | 18.53 | 9.65 | 305.61 | 308.49 |
| 86.33320937151358 | 18.49 | 12.26 | 298.65 | 301.52 |
| 86.50055782818893 | 18.25 | 14.21 | 292.81 | 295.71 |
| 86.66790628486427 | 17.97 | 15.67 | 287.38 | 290.29 |
| 86.83525474153961 | 17.76 | 17.38 | 282.17 | 285.09 |
| 87.00260319821496 | 17.61 | 19.82 | 277.33 | 280.38 |
| 87.16995165489031 | 17.49 | 22.39 | 272.87 | 276.09 |
| 87.33730011156564 | 17.36 | 25.16 | 268.6 | 272.01 |
| 87.504648568241 | 17.2 | 27.92 | 264.75 | 268.4 |
| 87.67199702491634 | 17.04 | 30.43 | 261.79 | 265.68 |
| 87.83004834510972 | 16.84 | 33.33 | 258.73 | 262.9 |
| 87.99739680178506 | 16.73 | 36.31 | 256.04 | 260.49 |
| 88.1647452584604 | 16.64 | 39.28 | 253.65 | 258.37 |
| 88.33209371513574 | 16.52 | 42.19 | 251.65 | 256.7 |
| 88.49944217181108 | 16.54 | 44.6 | 250.8 | 256.2 |
| 88.66679062848644 | 16.67 | 46.55 | 249.89 | 255.59 |
| 88.83413908516178 | 16.84 | 48.49 | 249.02 | 255.05 |
| 89.00148754183712 | 17.18 | 50.5 | 248.39 | 254.84 |
| 89.16883599851246 | 17.52 | 52.44 | 247.38 | 254.26 |
| 89.33618445518782 | 17.51 | 54.69 | 246.45 | 253.8 |
| 89.50353291186315 | 17.35 | 57.52 | 245.75 | 253.58 |
| 89.6708813685385 | 16.87 | 59.01 | 244.59 | 252.69 |
| 89.83822982521386 | 16.52 | 61.48 | 244.24 | 252.79 |
| 90.00557828188919 | 16.48 | 63.66 | 244.62 | 253.64 |
| 90.16362960208257 | 16.95 | 64.71 | 244.66 | 254.02 |
| 90.3309780587579 | 17.12 | 64.9 | 242 | 251.51 |
| 90.49832651543326 | 16.94 | 65.48 | 238.72 | 248.44 |
| 90.66567497210859 | 16.64 | 65.29 | 234.7 | 244.43 |
| 90.83302342878395 | 16.19 | 64.93 | 231.23 | 240.93 |
| 91.00037188545929 | 15.66 | 65.07 | 228.12 | 237.96 |
| 91.16772034213463 | 14.93 | 64.32 | 226.13 | 235.79 |
| 91.33506879880998 | 14.36 | 63.44 | 224.22 | 233.68 |
| 91.50241725548533 | 13.59 | 61.97 | 222.18 | 231.25 |
| 91.66976571216065 | 12.74 | 60.24 | 220.28 | 228.88 |
| 91.83711416883601 | 11.92 | 58.59 | 218.55 | 226.72 |
| 92.00446262551137 | 11.17 | 58.03 | 217.03 | 225.07 |
| 92.1718110821867 | 10.42 | 57.07 | 214.53 | 222.36 |
| 92.33915953886203 | 9.61 | 55.6 | 211.04 | 218.57 |
| 92.49721085905541 | 8.73 | 53.79 | 206.75 | 213.92 |
| 92.66455931573077 | 7.82 | 51.86 | 203.22 | 210.02 |
| 92.83190777240611 | 7 | 49.78 | 201.52 | 207.89 |
| 92.99925622908145 | 6.3 | 48.05 | 200.19 | 206.21 |
| 93.1666046857568 | 5.78 | 46.7 | 199.06 | 204.82 |
| 93.33395314243214 | 5.49 | 45.72 | 197.96 | 203.51 |
| 93.50130159910749 | 5.08 | 44.91 | 196.62 | 202.01 |
| 93.66865005578283 | 4.63 | 44.12 | 195.19 | 200.42 |
| 93.83599851245818 | 4.17 | 43.33 | 193.76 | 198.83 |
| 94.00334696913353 | 4.1 | 43.61 | 190.81 | 196.01 |
| 94.17069542580886 | 4.1 | 43.31 | 186.19 | 191.45 |
| 94.3380438824842 | 3.95 | 42.46 | 180.93 | 186.13 |
| 94.50539233915954 | 3.7 | 41.47 | 178.38 | 183.42 |
| 94.66344365935292 | 3.59 | 41.1 | 177.03 | 182.02 |
| 94.83079211602828 | 3.55 | 41.16 | 176.47 | 181.48 |
| 94.99814057270362 | 3.52 | 41.29 | 175.09 | 180.15 |
| 95.16548902937897 | 3.62 | 41.37 | 174.31 | 179.4 |
| 95.33283748605432 | 3.61 | 41.35 | 173.55 | 178.68 |
| 95.50018594272963 | 3.68 | 41.57 | 172.81 | 178.01 |
| 95.66753439940499 | 3.87 | 41.83 | 172.23 | 177.53 |
| 95.83488285608034 | 3.79 | 41.79 | 170.52 | 175.87 |
| 96.00223131275567 | 3.75 | 41.7 | 169.99 | 175.32 |
| 96.16957976943102 | 3.64 | 41.13 | 168.32 | 173.55 |
| 96.33692822610638 | 3.61 | 40.3 | 167.77 | 172.82 |
| 96.50427668278171 | 3.52 | 40.56 | 169.86 | 174.92 |
| 96.67162513945706 | 3.48 | 40.85 | 170.24 | 175.36 |
| 96.8389735961324 | 3.96 | 41.74 | 168.81 | 174.17 |
| 96.99702491632577 | 4.8 | 43.01 | 166.84 | 172.55 |
| 97.16437337300111 | 5.17 | 43.25 | 164.24 | 170.08 |
| 97.33172182967647 | 5.04 | 42.78 | 162.7 | 168.45 |
| 97.49907028635181 | 4.74 | 41.99 | 162.1 | 167.68 |
| 97.66641874302715 | 4.34 | 40.57 | 161.73 | 166.99 |
| 97.8337671997025 | 3.75 | 39.19 | 163.78 | 168.67 |
| 98.00111565637785 | 3.15 | 38.3 | 166.3 | 170.94 |
| 98.16846411305319 | 2.79 | 37.65 | 169.15 | 173.62 |
| 98.33581256972855 | 2.54 | 37.35 | 171.42 | 175.79 |
| 98.50316102640389 | 2.26 | 37.48 | 173.93 | 178.26 |
| 98.67050948307921 | 1.99 | 37.36 | 174.52 | 178.79 |
| 98.83785793975456 | 1.94 | 37.36 | 175.31 | 179.54 |
| 99.0052063964299 | 1.91 | 37.37 | 176.13 | 180.33 |
| 99.17255485310525 | 1.89 | 37.42 | 176.5 | 180.71 |
| 99.33060617329863 | 1.83 | 37.23 | 175.44 | 179.65 |
| 99.49795462997399 | 1.73 | 36.57 | 173.19 | 177.35 |
| 99.66530308664933 | 1.56 | 35.87 | 171.57 | 175.68 |
| 99.83265154332467 | 1.1 | 35.08 | 172.66 | 176.72 |
| 100.0 | 0.65 | 34.28 | 173.74 | 177.75 |